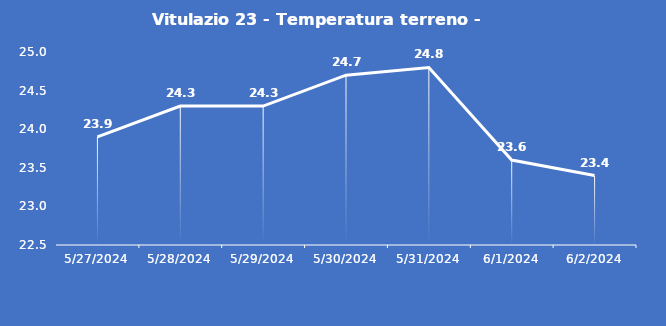
| Category | Vitulazio 23 - Temperatura terreno - Grezzo (°C) |
|---|---|
| 5/27/24 | 23.9 |
| 5/28/24 | 24.3 |
| 5/29/24 | 24.3 |
| 5/30/24 | 24.7 |
| 5/31/24 | 24.8 |
| 6/1/24 | 23.6 |
| 6/2/24 | 23.4 |